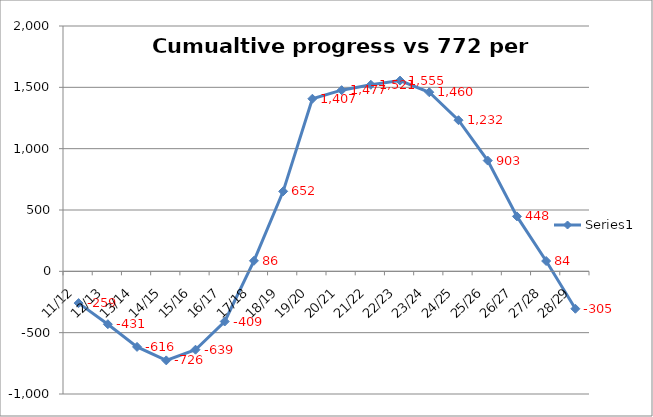
| Category | Series 0 |
|---|---|
| 11/12 | -259 |
| 12/13 | -431 |
| 13/14 | -616 |
| 14/15 | -726 |
| 15/16 | -639 |
| 16/17 | -409 |
| 17/18 | 86 |
| 18/19 | 652 |
| 19/20 | 1407 |
| 20/21 | 1477 |
| 21/22 | 1521 |
| 22/23 | 1555 |
| 23/24 | 1460 |
| 24/25 | 1232 |
| 25/26 | 903 |
| 26/27 | 448 |
| 27/28 | 84 |
| 28/29 | -305 |